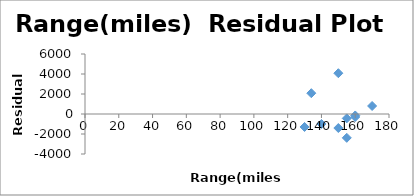
| Category | Series 0 |
|---|---|
| 130.0 | -1295.955 |
| 150.0 | -1401.764 |
| 155.0 | -2383.235 |
| 140.0 | -994.78 |
| 160.0 | -146.387 |
| 155.0 | -438.071 |
| 160.0 | -301.141 |
| 170.0 | 800.606 |
| 134.0 | 2081.076 |
| 150.0 | 4079.651 |